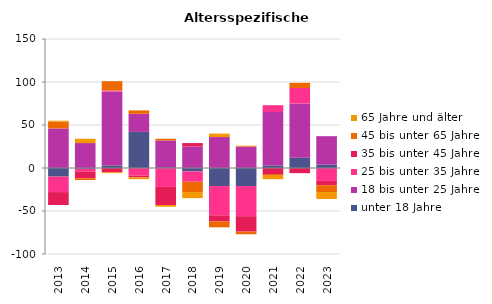
| Category | unter 18 Jahre | 18 bis unter 25 Jahre | 25 bis unter 35 Jahre | 35 bis unter 45 Jahre | 45 bis unter 65 Jahre | 65 Jahre und älter |
|---|---|---|---|---|---|---|
| 2013.0 | -10 | 46 | -18 | -15 | 8 | 1 |
| 2014.0 | -1 | 29 | -3 | -8 | -2 | 5 |
| 2015.0 | 3 | 86 | 1 | -5 | 11 | -1 |
| 2016.0 | 42 | 21 | -9 | -2 | 4 | -2 |
| 2017.0 | 1 | 31 | -22 | -21 | 2 | -2 |
| 2018.0 | -4 | 25 | -12 | 4 | -12 | -7 |
| 2019.0 | -21 | 36 | -34 | -7 | -7 | 4 |
| 2020.0 | -21 | 25 | -35 | -18 | -3 | 1 |
| 2021.0 | 3 | 62 | 8 | -7 | -2 | -4 |
| 2022.0 | 12 | 63 | 18 | -6 | 6 | 0 |
| 2023.0 | 4 | 33 | -15 | -5 | -8 | -8 |